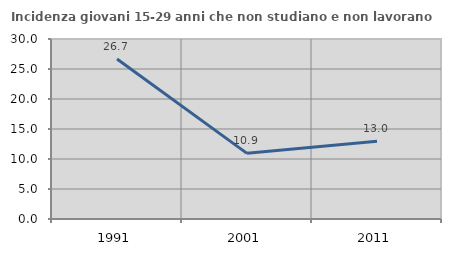
| Category | Incidenza giovani 15-29 anni che non studiano e non lavorano  |
|---|---|
| 1991.0 | 26.667 |
| 2001.0 | 10.943 |
| 2011.0 | 12.963 |